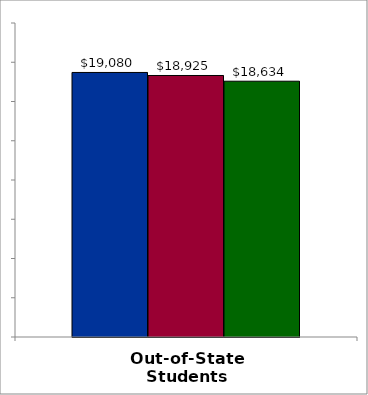
| Category | 50 states and D.C. | SREB states | State |
|---|---|---|---|
| Out-of-State Students | 19080 | 18925 | 18634 |